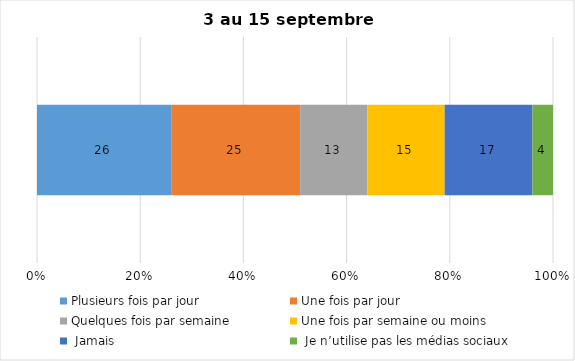
| Category | Plusieurs fois par jour | Une fois par jour | Quelques fois par semaine   | Une fois par semaine ou moins   |  Jamais   |  Je n’utilise pas les médias sociaux |
|---|---|---|---|---|---|---|
| 0 | 26 | 25 | 13 | 15 | 17 | 4 |